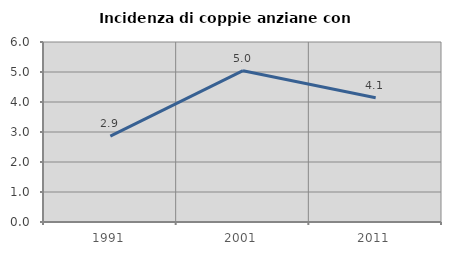
| Category | Incidenza di coppie anziane con figli |
|---|---|
| 1991.0 | 2.864 |
| 2001.0 | 5.045 |
| 2011.0 | 4.139 |